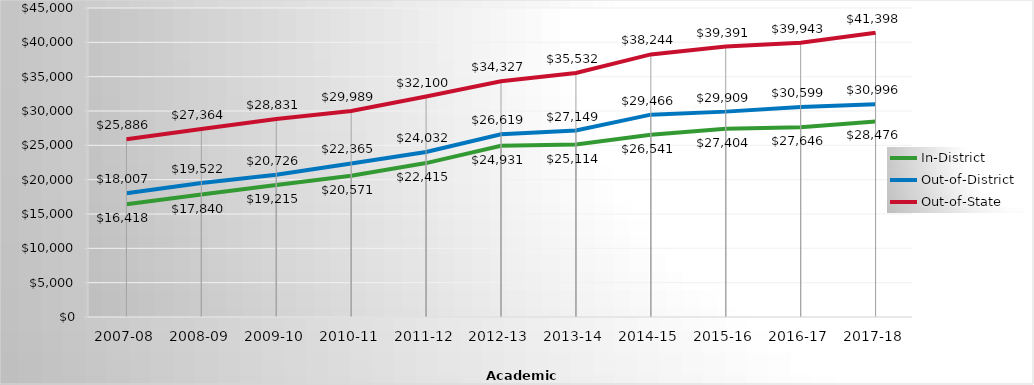
| Category | In-District | Out-of-District | Out-of-State |
|---|---|---|---|
| 2007-08 | 16418 | 18007 | 25886 |
| 2008-09 | 17839.697 | 19521.65 | 27363.58 |
| 2009-10 | 19215 | 20726 | 28831 |
| 2010-11 | 20571 | 22365 | 29989 |
| 2011-12 | 22415 | 24032 | 32100 |
| 2012-13 | 24931 | 26619 | 34327 |
| 2013-14 | 25114.27 | 27148.6 | 35532.25 |
| 2014-15 | 26541.34 | 29465.87 | 38243.8 |
| 2015-16 | 27404 | 29909 | 39391 |
| 2016-17 | 27646 | 30599 | 39943 |
| 2017-18 | 28476 | 30996 | 41398 |